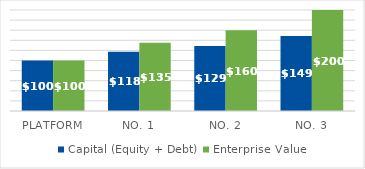
| Category | Capital (Equity + Debt) | Enterprise Value |
|---|---|---|
| Platform | 100 | 100 |
| No. 1 | 117.5 | 135 |
| No. 2 | 128.75 | 160 |
| No. 3 | 148.75 | 200 |